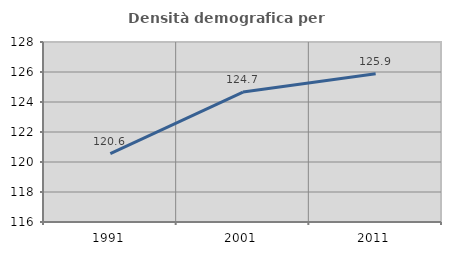
| Category | Densità demografica |
|---|---|
| 1991.0 | 120.56 |
| 2001.0 | 124.663 |
| 2011.0 | 125.885 |